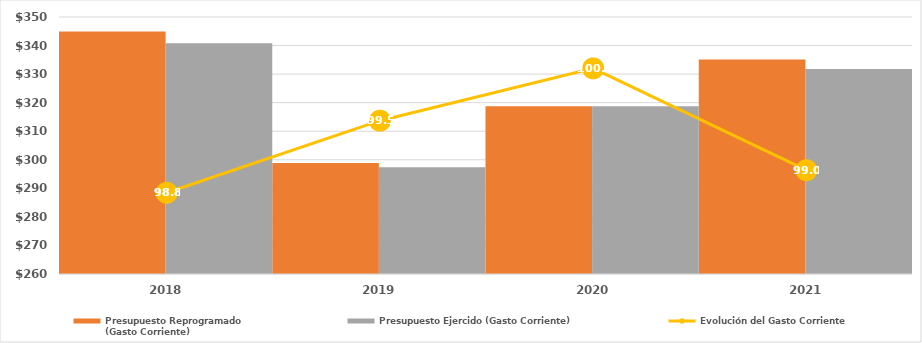
| Category | Presupuesto Reprogramado
(Gasto Corriente) | Presupuesto Ejercido (Gasto Corriente) |
|---|---|---|
| 2018.0 | 344938.7 | 340765 |
| 2019.0 | 298904.428 | 297383.7 |
| 2020.0 | 318785.247 | 318785.247 |
| 2021.0 | 335107.39 | 331789.211 |